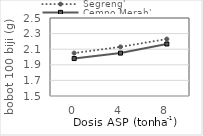
| Category | Segreng' | Cempo Merah' |
|---|---|---|
| 0.0 | 2.05 | 1.98 |
| 4.0 | 2.13 | 2.05 |
| 8.0 | 2.23 | 2.167 |